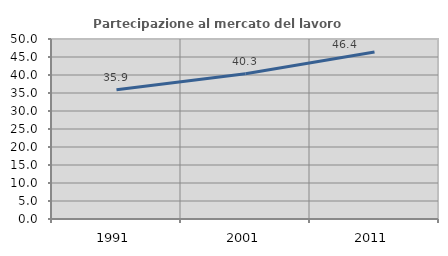
| Category | Partecipazione al mercato del lavoro  femminile |
|---|---|
| 1991.0 | 35.889 |
| 2001.0 | 40.335 |
| 2011.0 | 46.407 |